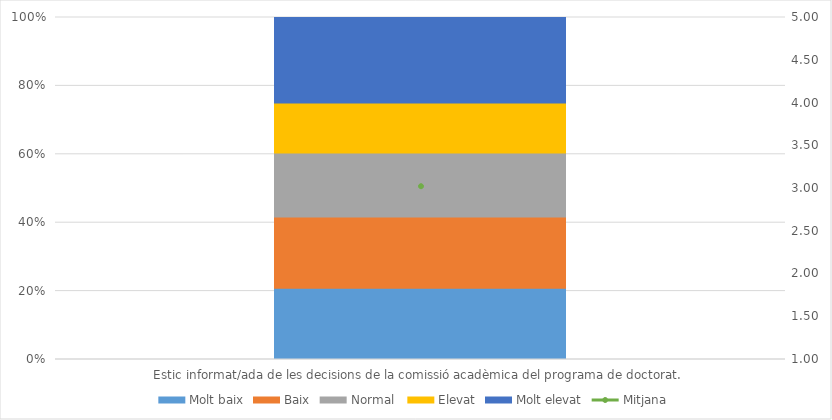
| Category | Molt baix | Baix | Normal  | Elevat | Molt elevat |
|---|---|---|---|---|---|
| Estic informat/ada de les decisions de la comissió acadèmica del programa de doctorat. | 10 | 10 | 9 | 7 | 12 |